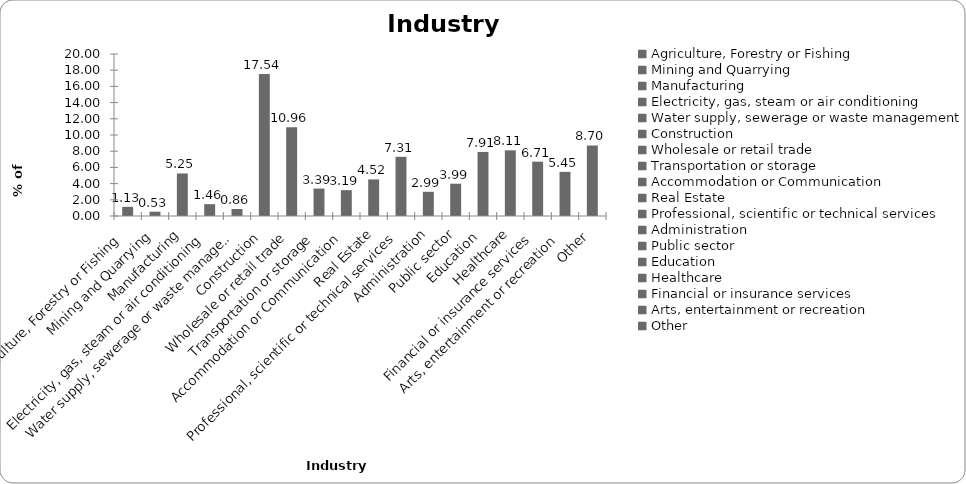
| Category | Series 0 |
|---|---|
| Agriculture, Forestry or Fishing | 1.13 |
| Mining and Quarrying | 0.532 |
| Manufacturing | 5.249 |
| Electricity, gas, steam or air conditioning | 1.462 |
| Water supply, sewerage or waste management | 0.864 |
| Construction | 17.542 |
| Wholesale or retail trade | 10.963 |
| Transportation or storage | 3.389 |
| Accommodation or Communication | 3.189 |
| Real Estate | 4.518 |
| Professional, scientific or technical services | 7.309 |
| Administration | 2.99 |
| Public sector | 3.987 |
| Education | 7.907 |
| Healthcare | 8.106 |
| Financial or insurance services | 6.711 |
| Arts, entertainment or recreation | 5.449 |
| Other | 8.704 |